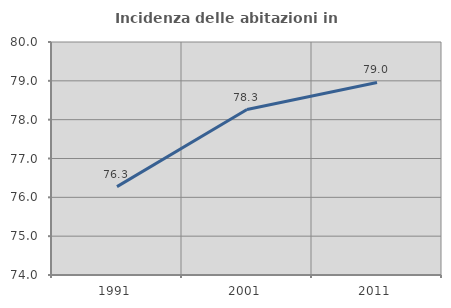
| Category | Incidenza delle abitazioni in proprietà  |
|---|---|
| 1991.0 | 76.276 |
| 2001.0 | 78.261 |
| 2011.0 | 78.959 |